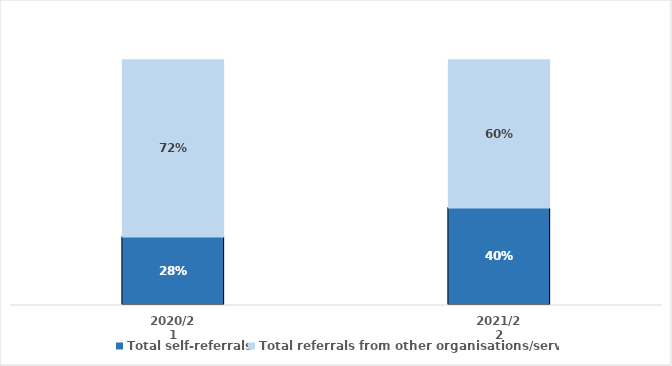
| Category | Total self-referrals | Total referrals from other organisations/services |
|---|---|---|
| 2020/21 | 0.279 | 0.721 |
| 2021/22 | 0.397 | 0.603 |